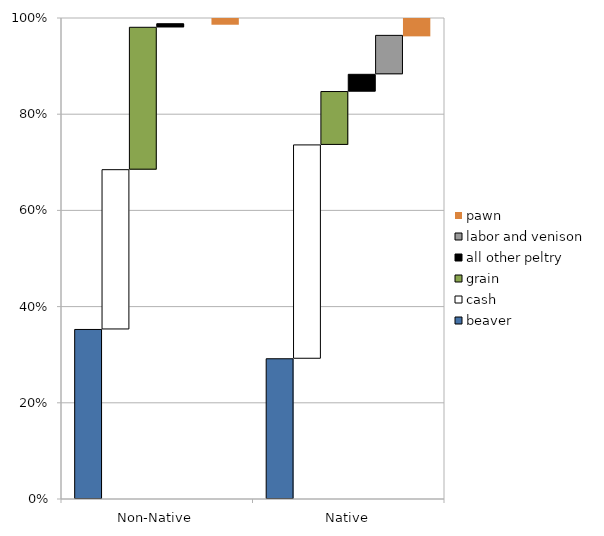
| Category | beaver | cash | grain | all other peltry | labor and venison | pawn |
|---|---|---|---|---|---|---|
| Non-Native | 0.352 | 0.332 | 0.296 | 0.007 | 0 | 0.012 |
| Native | 0.292 | 0.445 | 0.111 | 0.036 | 0.081 | 0.036 |